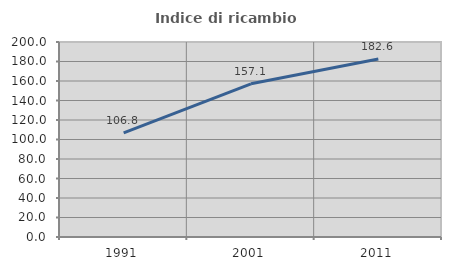
| Category | Indice di ricambio occupazionale  |
|---|---|
| 1991.0 | 106.818 |
| 2001.0 | 157.143 |
| 2011.0 | 182.609 |